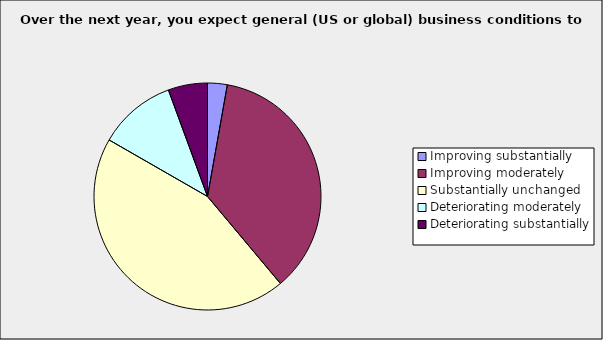
| Category | Series 0 |
|---|---|
| Improving substantially | 0.028 |
| Improving moderately | 0.361 |
| Substantially unchanged | 0.444 |
| Deteriorating moderately | 0.111 |
| Deteriorating substantially | 0.056 |